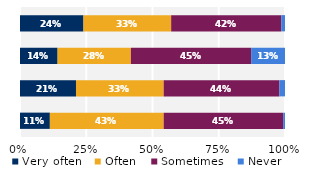
| Category | Very often | Often | Sometimes | Never |
|---|---|---|---|---|
| Talked about students' career plans | 0.239 | 0.331 | 0.415 | 0.014 |
| Worked on activities other than 
coursework | 0.142 | 0.277 | 0.454 | 0.128 |
| Discussed course topics, ideas, or concepts 
outside of class | 0.211 | 0.331 | 0.437 | 0.021 |
| Discussed students' academic performance | 0.113 | 0.43 | 0.451 | 0.007 |